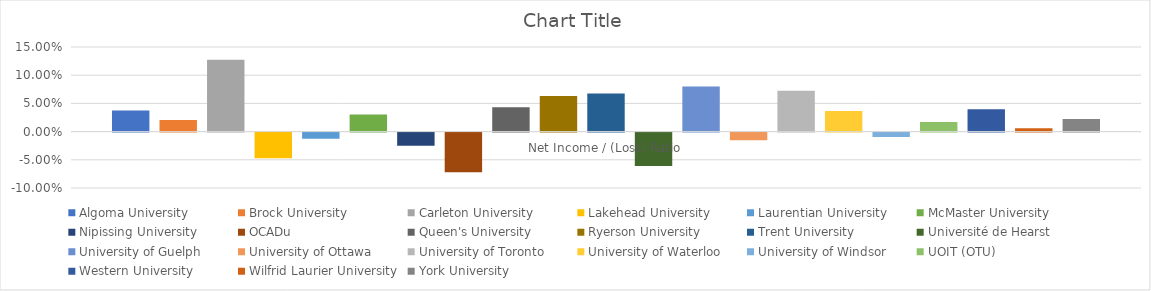
| Category | Algoma University | Brock University | Carleton University | Lakehead University | Laurentian University | McMaster University | Nipissing University | OCADu | Queen's University | Ryerson University | Trent University | Université de Hearst | University of Guelph | University of Ottawa | University of Toronto | University of Waterloo | University of Windsor | UOIT (OTU) | Western University | Wilfrid Laurier University | York University |
|---|---|---|---|---|---|---|---|---|---|---|---|---|---|---|---|---|---|---|---|---|---|
| Net Income / (Loss) Ratio | 0.038 | 0.02 | 0.127 | -0.046 | -0.011 | 0.03 | -0.023 | -0.07 | 0.043 | 0.063 | 0.068 | -0.059 | 0.08 | -0.014 | 0.072 | 0.036 | -0.008 | 0.017 | 0.04 | 0.006 | 0.022 |